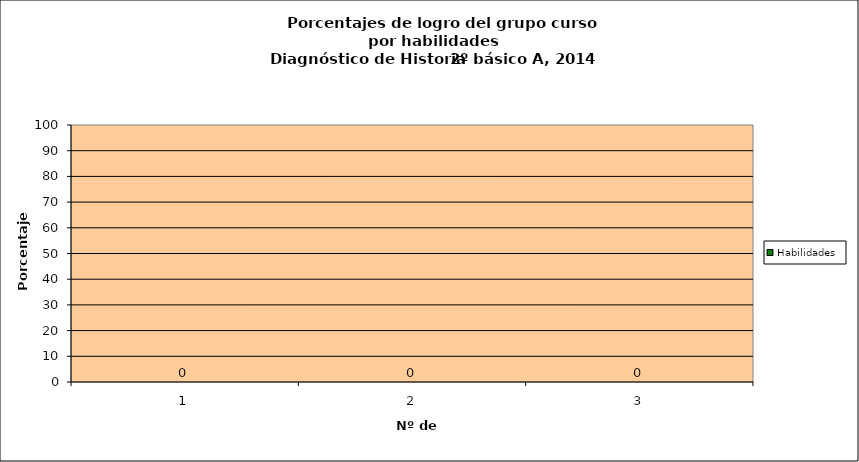
| Category | Habilidades |
|---|---|
| 0 | 0 |
| 1 | 0 |
| 2 | 0 |